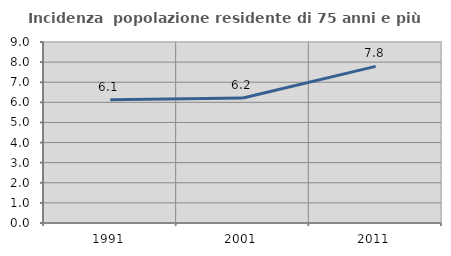
| Category | Incidenza  popolazione residente di 75 anni e più |
|---|---|
| 1991.0 | 6.127 |
| 2001.0 | 6.214 |
| 2011.0 | 7.79 |